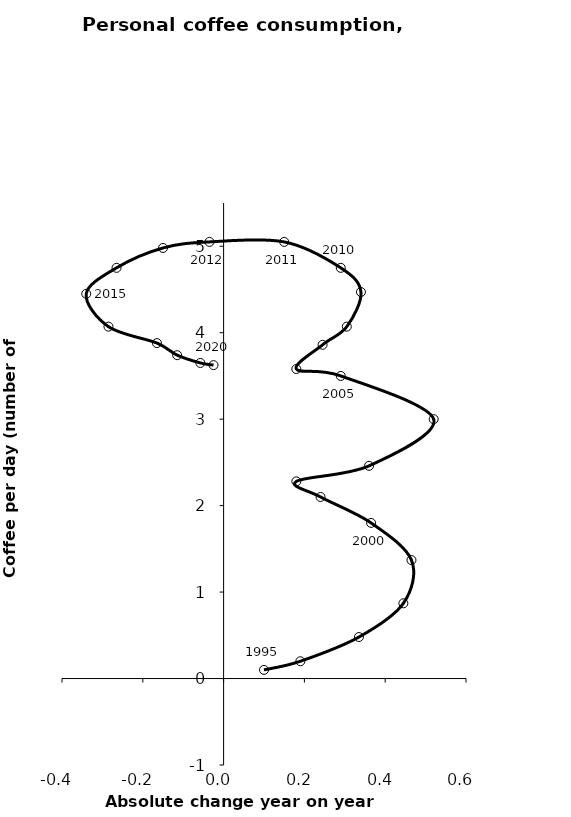
| Category | Series 0 |
|---|---|
| 0.1 | 0.1 |
| 0.19 | 0.2 |
| 0.33499999999999996 | 0.48 |
| 0.44500000000000006 | 0.87 |
| 0.465 | 1.37 |
| 0.365 | 1.8 |
| 0.23999999999999988 | 2.1 |
| 0.17999999999999994 | 2.28 |
| 0.3600000000000001 | 2.46 |
| 0.52 | 3 |
| 0.29000000000000004 | 3.5 |
| 0.17999999999999994 | 3.58 |
| 0.2450000000000001 | 3.86 |
| 0.30499999999999994 | 4.07 |
| 0.33999999999999986 | 4.47 |
| 0.29000000000000004 | 4.75 |
| 0.1499999999999999 | 5.05 |
| -0.0349999999999997 | 5.05 |
| -0.1499999999999999 | 4.98 |
| -0.2650000000000001 | 4.75 |
| -0.33999999999999986 | 4.45 |
| -0.28500000000000014 | 4.07 |
| -0.16500000000000004 | 3.88 |
| -0.11499999999999999 | 3.74 |
| -0.05750000000000011 | 3.65 |
| -0.02499999999999991 | 3.625 |